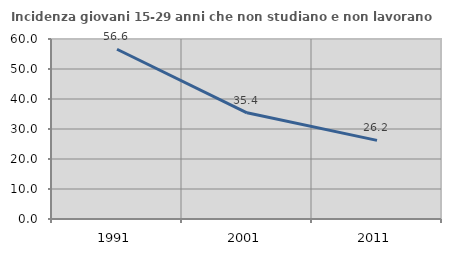
| Category | Incidenza giovani 15-29 anni che non studiano e non lavorano  |
|---|---|
| 1991.0 | 56.592 |
| 2001.0 | 35.389 |
| 2011.0 | 26.205 |